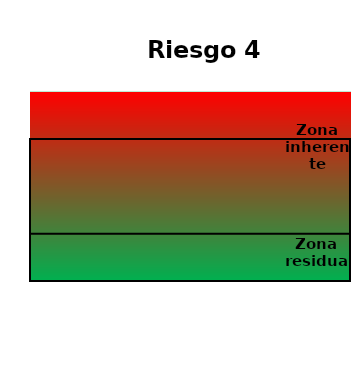
| Category | Zona  | Zona Residual | Zona inherente |
|---|---|---|---|
| Riesgo 4 | 4 | 1 | 3 |